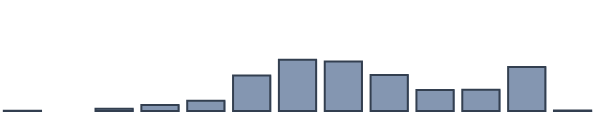
| Category | Series 0 |
|---|---|
| 0 | 0.122 |
| 1 | 0 |
| 2 | 0.791 |
| 3 | 2.154 |
| 4 | 3.707 |
| 5 | 12.814 |
| 6 | 18.434 |
| 7 | 17.865 |
| 8 | 12.948 |
| 9 | 7.561 |
| 10 | 7.619 |
| 11 | 15.815 |
| 12 | 0.169 |